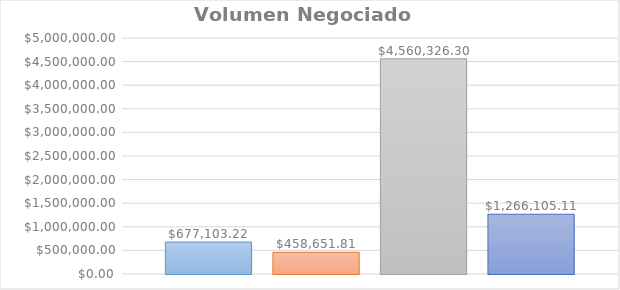
| Category | S14 | S15 | S16 | S17 |
|---|---|---|---|---|
| 0 | 677103.22 | 458651.81 | 4560326.3 | 1266105.11 |